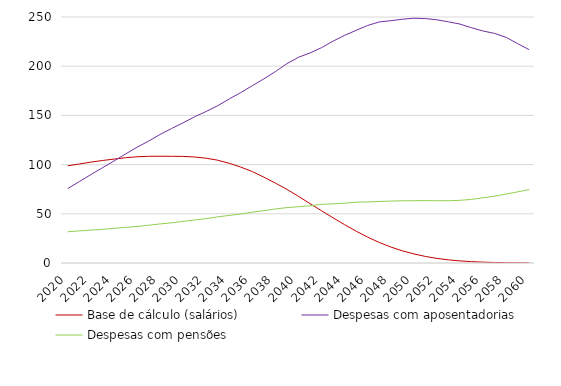
| Category | Base de cálculo (salários) | Despesas com aposentadorias | Despesas com pensões |
|---|---|---|---|
| 2020.0 | 98788007468.144 | 75612971613.804 | 31738928177.97 |
| 2021.0 | 100603403524.683 | 82732119313.988 | 32629334317.733 |
| 2022.0 | 102520234409.448 | 89790574183.916 | 33442662127.389 |
| 2023.0 | 104145898102.392 | 96754667634.002 | 34189667072.831 |
| 2024.0 | 105587426840.22 | 103550376701.937 | 35232394604.782 |
| 2025.0 | 106970968203.312 | 110731864948.974 | 36207999278.437 |
| 2026.0 | 107977479143.127 | 117594786990.557 | 37115863805.029 |
| 2027.0 | 108427870491.178 | 123845771663.67 | 38349295659.737 |
| 2028.0 | 108495579584.645 | 130596092394.642 | 39712136153.036 |
| 2029.0 | 108437666472.448 | 136683272993.763 | 40810745455.593 |
| 2030.0 | 108336505614.699 | 142453496929.029 | 42315255748.987 |
| 2031.0 | 107716817053.573 | 148657495144.766 | 43737517810.648 |
| 2032.0 | 106497358829.402 | 154008292380.723 | 45136533890.173 |
| 2033.0 | 104474504108.863 | 159893248428.188 | 46901903688.339 |
| 2034.0 | 101326883386.336 | 166749401630.582 | 48360831454.02 |
| 2035.0 | 97443531865.268 | 173217591450.666 | 49841401701.078 |
| 2036.0 | 92897743115.839 | 180221514206.784 | 51604230723.903 |
| 2037.0 | 87247671446.144 | 187159251812.068 | 53230217295.998 |
| 2038.0 | 81174115916.353 | 194564780563.25 | 54900940507.078 |
| 2039.0 | 74793988719.672 | 202600174352.343 | 56289957775.488 |
| 2040.0 | 67733657076.486 | 209067136177.018 | 57237491499.088 |
| 2041.0 | 60340244896.81 | 213451709193.301 | 58104983226.796 |
| 2042.0 | 53051961141.781 | 218851084393.488 | 59589453490.592 |
| 2043.0 | 45902977591.967 | 225507986924.591 | 60122164881.842 |
| 2044.0 | 38925196377.883 | 231373043809.867 | 60789789434.358 |
| 2045.0 | 32327246835.596 | 236479611346.877 | 61789095252.319 |
| 2046.0 | 26257365739.634 | 241413968895.106 | 62044455061.346 |
| 2047.0 | 20867900772.785 | 244989663470.622 | 62516436928.517 |
| 2048.0 | 16241814658.209 | 246243240490.437 | 62943215410.141 |
| 2049.0 | 12377423428.92 | 247726019492.037 | 63266459477.49 |
| 2050.0 | 9215102586.373 | 248751684587.581 | 63275251660.746 |
| 2051.0 | 6653464686.812 | 248372000012.117 | 63415588143.354 |
| 2052.0 | 4661421423.959 | 247173675107.123 | 63277810851.936 |
| 2053.0 | 3189012929.105 | 245091275060.465 | 63307590145.148 |
| 2054.0 | 2112355843.145 | 242794686102.682 | 63702729296.916 |
| 2055.0 | 1377196670.306 | 239046896030.566 | 64647877893.814 |
| 2056.0 | 877689374.483 | 235757259148.535 | 66328573206.544 |
| 2057.0 | 535705436.604 | 233313003523.892 | 67873692904.067 |
| 2058.0 | 325136362.051 | 229324631946.76 | 70119189503.881 |
| 2059.0 | 197526014.72 | 222903474035.176 | 72302641712.201 |
| 2060.0 | 118649659.369 | 216782209653.463 | 74659476581.208 |